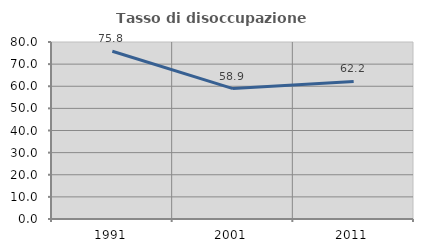
| Category | Tasso di disoccupazione giovanile  |
|---|---|
| 1991.0 | 75.836 |
| 2001.0 | 58.947 |
| 2011.0 | 62.195 |